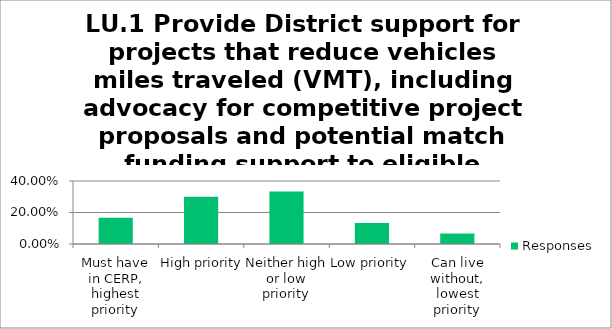
| Category | Responses |
|---|---|
| Must have in CERP, highest priority | 0.167 |
| High priority | 0.3 |
| Neither high or low priority | 0.333 |
| Low priority | 0.133 |
| Can live without, lowest priority | 0.067 |